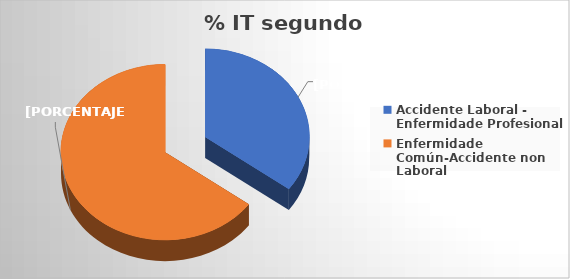
| Category | Series 0 |
|---|---|
| Accidente Laboral - Enfermidade Profesional | 294 |
| Enfermidade Común-Accidente non Laboral | 543 |